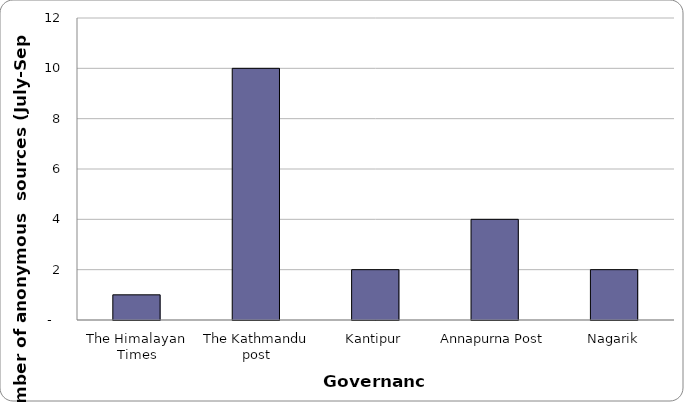
| Category | Governance |
|---|---|
| The Himalayan Times | 1 |
| The Kathmandu post | 10 |
| Kantipur | 2 |
| Annapurna Post | 4 |
| Nagarik | 2 |